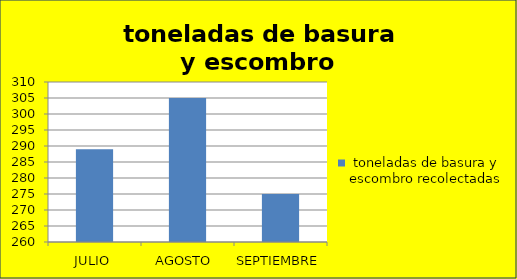
| Category | toneladas de basura y escombro recolectadas   |
|---|---|
| JULIO | 289 |
| AGOSTO  | 305 |
| SEPTIEMBRE | 275 |